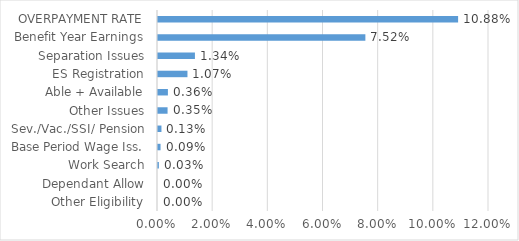
| Category | Series 0 |
|---|---|
| Other Eligibility | 0 |
| Dependant Allow | 0 |
| Work Search | 0 |
| Base Period Wage Iss. | 0.001 |
| Sev./Vac./SSI/ Pension | 0.001 |
| Other Issues | 0.003 |
| Able + Available | 0.004 |
| ES Registration | 0.011 |
| Separation Issues | 0.013 |
| Benefit Year Earnings | 0.075 |
| OVERPAYMENT RATE | 0.109 |